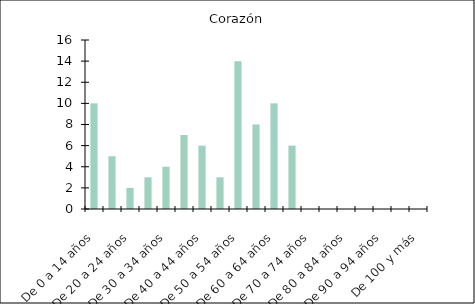
| Category | Corazón |
|---|---|
| De 0 a 14 años | 10 |
| De 15 a 19 años | 5 |
| De 20 a 24 años | 2 |
| De 25 a 29 años | 3 |
| De 30 a 34 años | 4 |
| De 35 a 39 años | 7 |
| De 40 a 44 años | 6 |
| De 45 a 49 años | 3 |
| De 50 a 54 años | 14 |
| De 55 a 59 años | 8 |
| De 60 a 64 años | 10 |
| De 65 a 69 años | 6 |
| De 70 a 74 años | 0 |
| De 75 a 79 años | 0 |
| De 80 a 84 años | 0 |
| De 85 a 89 años | 0 |
| De 90 a 94 años | 0 |
| De 95 a 99 años | 0 |
| De 100 y más | 0 |